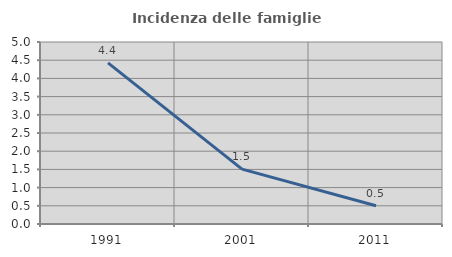
| Category | Incidenza delle famiglie numerose |
|---|---|
| 1991.0 | 4.428 |
| 2001.0 | 1.509 |
| 2011.0 | 0.501 |